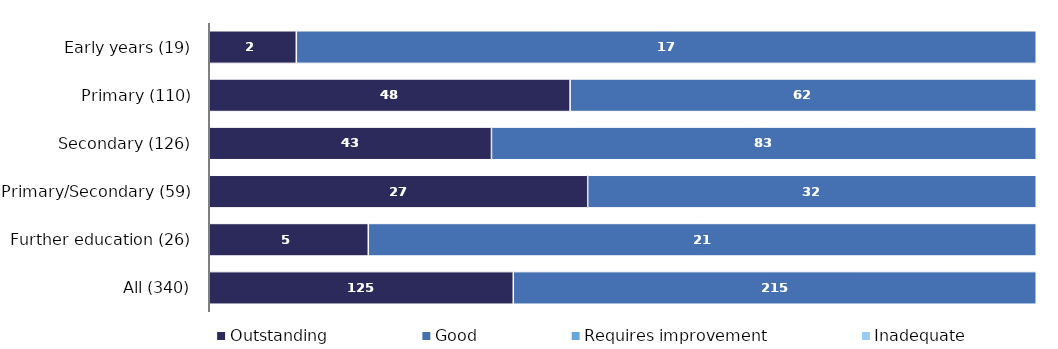
| Category | Outstanding | Good | Requires improvement | Inadequate |
|---|---|---|---|---|
| Early years (19) | 2 | 17 | 0 | 0 |
| Primary (110) | 48 | 62 | 0 | 0 |
| Secondary (126) | 43 | 83 | 0 | 0 |
| Primary/Secondary (59) | 27 | 32 | 0 | 0 |
| Further education (26) | 5 | 21 | 0 | 0 |
| All (340) | 125 | 215 | 0 | 0 |